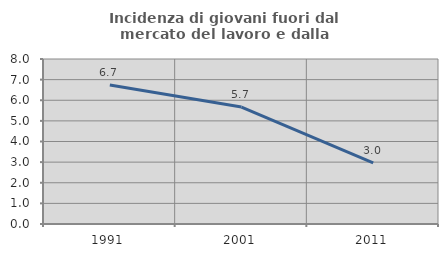
| Category | Incidenza di giovani fuori dal mercato del lavoro e dalla formazione  |
|---|---|
| 1991.0 | 6.742 |
| 2001.0 | 5.668 |
| 2011.0 | 2.959 |